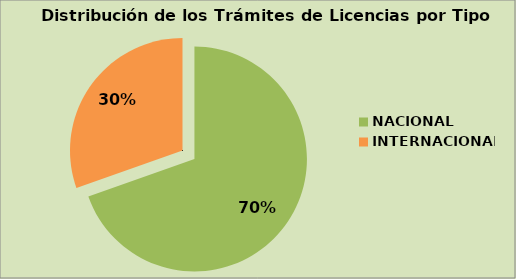
| Category | Series 0 |
|---|---|
| NACIONAL | 69.601 |
| INTERNACIONAL | 30.399 |